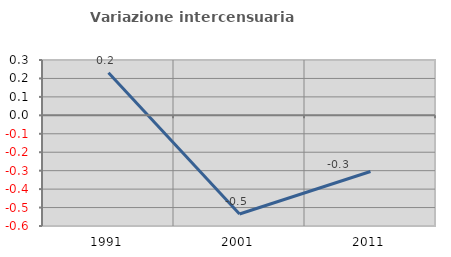
| Category | Variazione intercensuaria annua |
|---|---|
| 1991.0 | 0.231 |
| 2001.0 | -0.535 |
| 2011.0 | -0.305 |